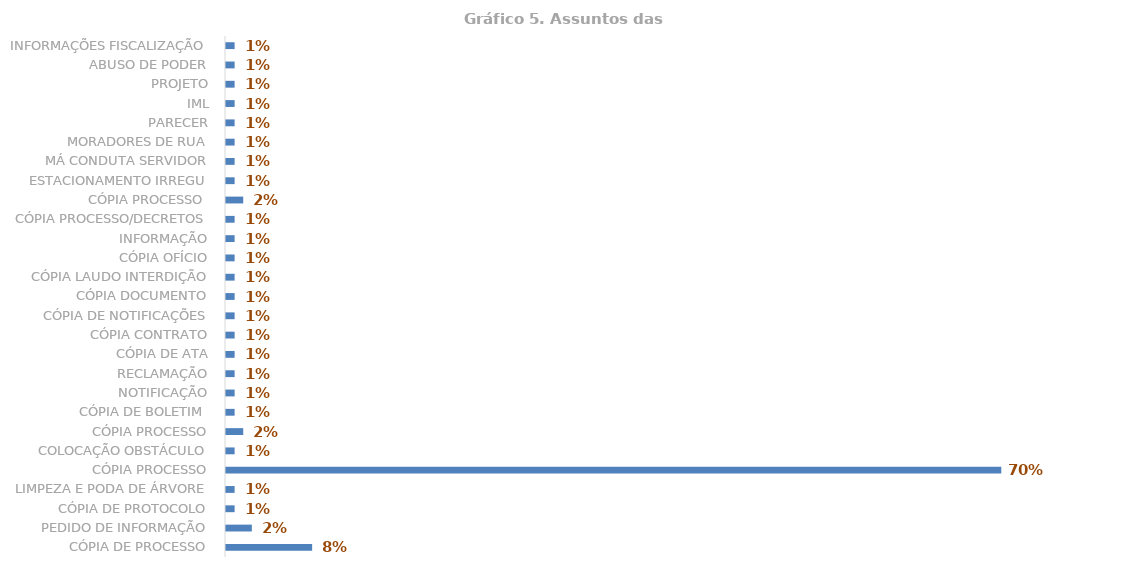
| Category | Total |
|---|---|
| CÓPIA DE PROCESSO | 0.078 |
| PEDIDO DE INFORMAÇÃO | 0.023 |
| CÓPIA DE PROTOCOLO | 0.008 |
| LIMPEZA E PODA DE ÁRVORE | 0.008 |
| CÓPIA PROCESSO | 0.698 |
| COLOCAÇÃO OBSTÁCULO | 0.008 |
|  CÓPIA PROCESSO | 0.016 |
| CÓPIA DE BOLETIM  | 0.008 |
| NOTIFICAÇÃO | 0.008 |
| RECLAMAÇÃO | 0.008 |
| CÓPIA DE ATA | 0.008 |
| CÓPIA CONTRATO | 0.008 |
| CÓPIA DE NOTIFICAÇÕES | 0.008 |
| CÓPIA DOCUMENTO | 0.008 |
| CÓPIA LAUDO INTERDIÇÃO | 0.008 |
| CÓPIA OFÍCIO | 0.008 |
| INFORMAÇÃO | 0.008 |
| CÓPIA PROCESSO/DECRETOS | 0.008 |
| CÓPIA PROCESSO  | 0.016 |
| ESTACIONAMENTO IRREGU | 0.008 |
| MÁ CONDUTA SERVIDOR | 0.008 |
| MORADORES DE RUA | 0.008 |
| PARECER | 0.008 |
| IML | 0.008 |
| PROJETO | 0.008 |
| ABUSO DE PODER | 0.008 |
| INFORMAÇÕES FISCALIZAÇÃO | 0.008 |